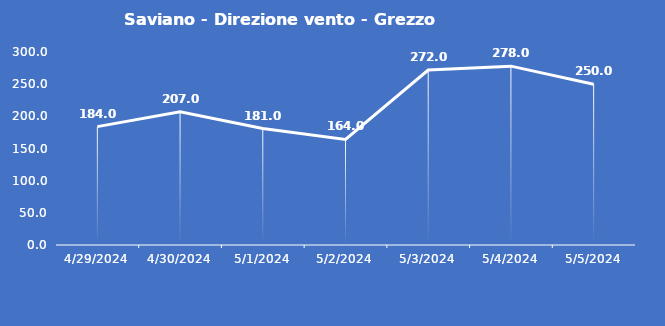
| Category | Saviano - Direzione vento - Grezzo (°N) |
|---|---|
| 4/29/24 | 184 |
| 4/30/24 | 207 |
| 5/1/24 | 181 |
| 5/2/24 | 164 |
| 5/3/24 | 272 |
| 5/4/24 | 278 |
| 5/5/24 | 250 |